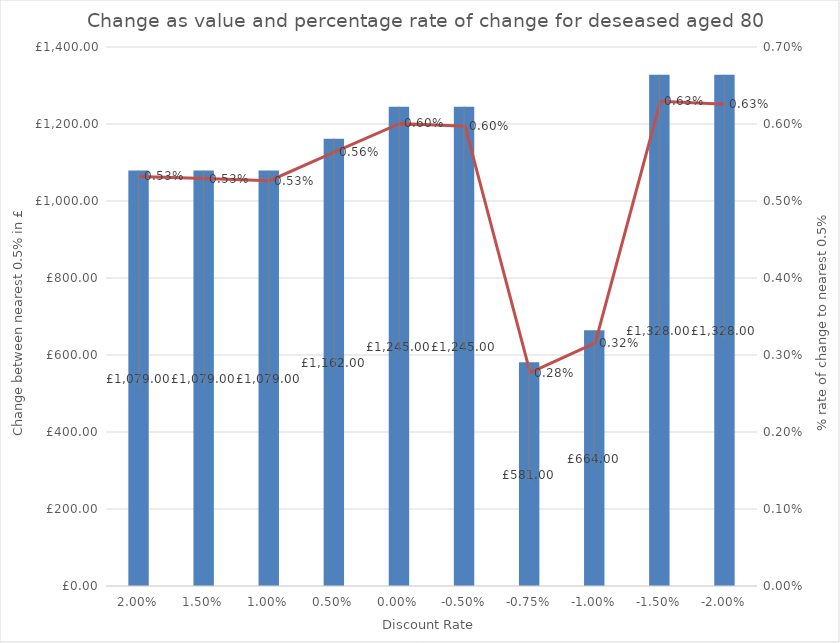
| Category | Value change |
|---|---|
| 0.02 | 1079 |
| 0.015 | 1079 |
| 0.01 | 1079 |
| 0.005 | 1162 |
| 0.0 | 1245 |
| -0.005 | 1245 |
| -0.0075 | 581 |
| -0.01 | 664 |
| -0.015 | 1328 |
| -0.02 | 1328 |